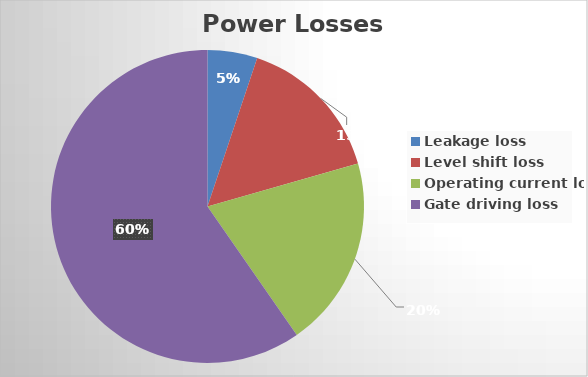
| Category | Series 0 |
|---|---|
| Leakage loss | 20.7 |
| Level shift loss | 62.1 |
| Operating current loss | 79.47 |
| Gate driving loss | 240 |